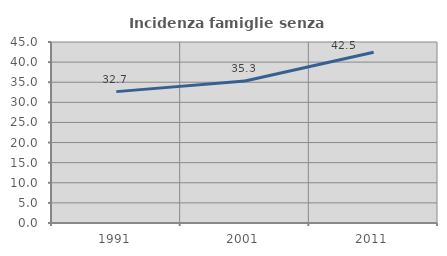
| Category | Incidenza famiglie senza nuclei |
|---|---|
| 1991.0 | 32.663 |
| 2001.0 | 35.305 |
| 2011.0 | 42.455 |